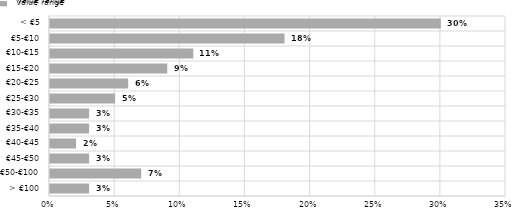
| Category | Value range |
|---|---|
| > €100 | 0.03 |
| €50-€100 | 0.07 |
| €45-€50 | 0.03 |
| €40-€45 | 0.02 |
| €35-€40 | 0.03 |
| €30-€35 | 0.03 |
| €25-€30 | 0.05 |
| €20-€25 | 0.06 |
| €15-€20 | 0.09 |
| €10-€15 | 0.11 |
| €5-€10 | 0.18 |
| < €5 | 0.3 |